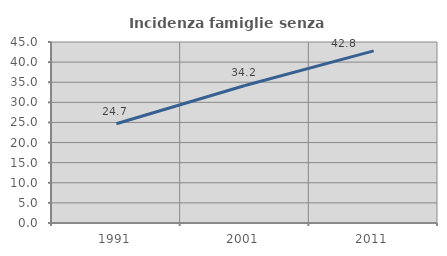
| Category | Incidenza famiglie senza nuclei |
|---|---|
| 1991.0 | 24.679 |
| 2001.0 | 34.191 |
| 2011.0 | 42.79 |